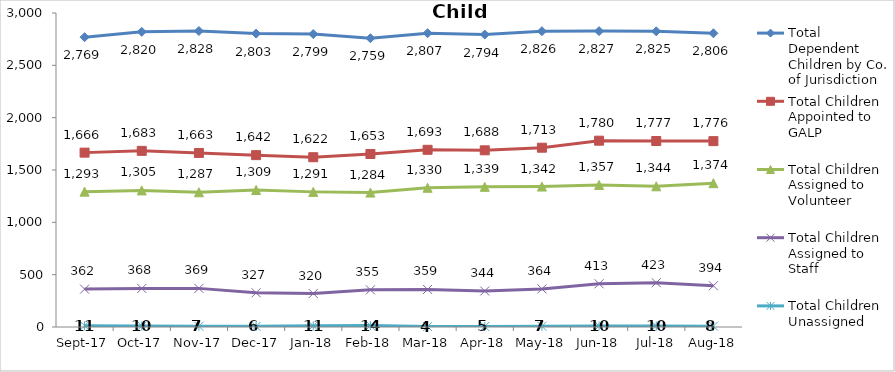
| Category | Total Dependent Children by Co. of Jurisdiction | Total Children Appointed to GALP | Total Children Assigned to Volunteer | Total Children Assigned to Staff | Total Children Unassigned |
|---|---|---|---|---|---|
| 2017-09-01 | 2769 | 1666 | 1293 | 362 | 11 |
| 2017-10-01 | 2820 | 1683 | 1305 | 368 | 10 |
| 2017-11-01 | 2828 | 1663 | 1287 | 369 | 7 |
| 2017-12-01 | 2803 | 1642 | 1309 | 327 | 6 |
| 2018-01-01 | 2799 | 1622 | 1291 | 320 | 11 |
| 2018-02-01 | 2759 | 1653 | 1284 | 355 | 14 |
| 2018-03-01 | 2807 | 1693 | 1330 | 359 | 4 |
| 2018-04-01 | 2794 | 1688 | 1339 | 344 | 5 |
| 2018-05-01 | 2826 | 1713 | 1342 | 364 | 7 |
| 2018-06-01 | 2827 | 1780 | 1357 | 413 | 10 |
| 2018-07-01 | 2825 | 1777 | 1344 | 423 | 10 |
| 2018-08-01 | 2806 | 1776 | 1374 | 394 | 8 |